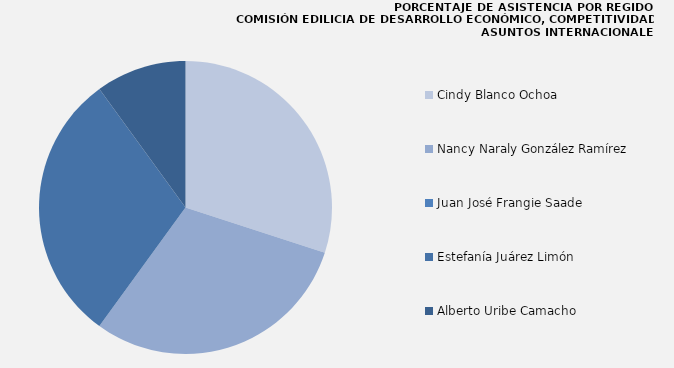
| Category | Series 0 |
|---|---|
| Cindy Blanco Ochoa | 100 |
| Nancy Naraly González Ramírez | 100 |
| Juan José Frangie Saade | 0 |
| Estefanía Juárez Limón | 100 |
| Alberto Uribe Camacho | 33.333 |